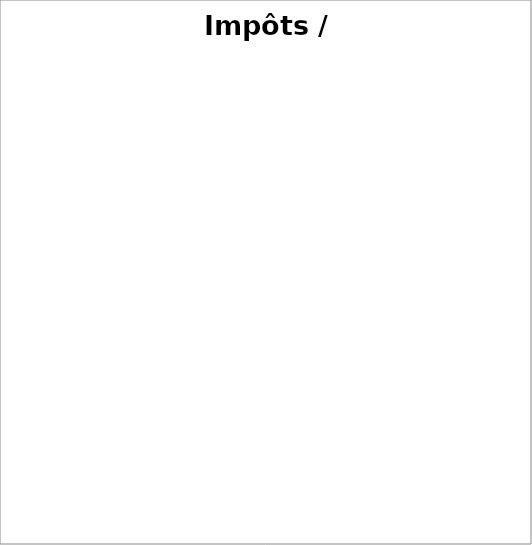
| Category | Series 0 |
|---|---|
| Impôt sur le revenu | 0 |
| Taxe d'habitation / taxe foncière | 0 |
| Redevance télé | 0 |
| Épargne | 0 |
| Pension alimentaire | 0 |
| Autre impôt ou taxe | 0 |